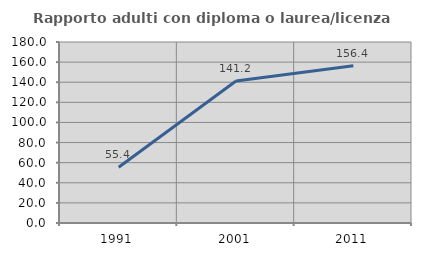
| Category | Rapporto adulti con diploma o laurea/licenza media  |
|---|---|
| 1991.0 | 55.435 |
| 2001.0 | 141.176 |
| 2011.0 | 156.376 |